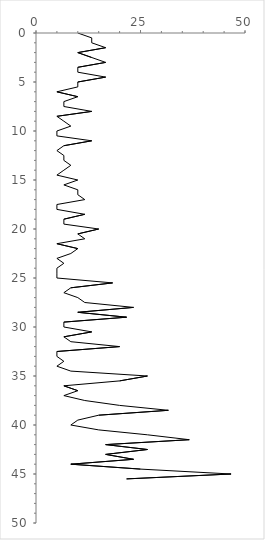
| Category | Series 0 |
|---|---|
| 10.000000000000002 | 0 |
| 13.333333333333334 | 0.5 |
| 13.333333333333334 | 1 |
| 16.666666666666664 | 1.5 |
| 10.000000000000002 | 2 |
| 13.333333333333334 | 2.5 |
| 16.666666666666664 | 3 |
| 10.000000000000002 | 3.5 |
| 10.000000000000002 | 4 |
| 16.666666666666664 | 4.5 |
| 10.000000000000002 | 5 |
| 10.0 | 5.5 |
| 5.000000000000001 | 6 |
| 10.0 | 6.5 |
| 6.666666666666667 | 7 |
| 6.666666666666667 | 7.5 |
| 13.333333333333334 | 8 |
| 5.000000000000001 | 8.5 |
| 6.666666666666667 | 9 |
| 8.333333333333332 | 9.5 |
| 5.000000000000001 | 10 |
| 5.000000000000001 | 10.5 |
| 13.333333333333334 | 11 |
| 6.666666666666667 | 11.5 |
| 5.000000000000001 | 12 |
| 6.666666666666667 | 12.5 |
| 6.666666666666667 | 13 |
| 8.333333333333332 | 13.5 |
| 6.666666666666667 | 14 |
| 5.000000000000001 | 14.5 |
| 10.0 | 15 |
| 6.666666666666667 | 15.5 |
| 10.0 | 16 |
| 10.0 | 16.5 |
| 11.666666666666668 | 17 |
| 5.000000000000001 | 17.5 |
| 5.000000000000001 | 18 |
| 11.666666666666668 | 18.5 |
| 6.666666666666667 | 19 |
| 6.666666666666667 | 19.5 |
| 15.0 | 20 |
| 10.000000000000002 | 20.5 |
| 11.666666666666668 | 21 |
| 5.000000000000001 | 21.5 |
| 10.0 | 22 |
| 8.333333333333332 | 22.5 |
| 5.000000000000001 | 23 |
| 6.666666666666667 | 23.5 |
| 5.000000000000001 | 24 |
| 5.000000000000001 | 24.5 |
| 5.000000000000001 | 25 |
| 18.333333333333336 | 25.5 |
| 8.333333333333332 | 26 |
| 6.666666666666667 | 26.5 |
| 10.000000000000002 | 27 |
| 11.666666666666668 | 27.5 |
| 23.333333333333332 | 28 |
| 10.000000000000002 | 28.5 |
| 21.666666666666668 | 29 |
| 6.666666666666667 | 29.5 |
| 6.666666666666667 | 30 |
| 13.333333333333334 | 30.5 |
| 6.666666666666667 | 31 |
| 8.333333333333332 | 31.5 |
| 20.0 | 32 |
| 5.000000000000001 | 32.5 |
| 5.000000000000001 | 33 |
| 6.666666666666667 | 33.5 |
| 5.000000000000001 | 34 |
| 8.333333333333332 | 34.5 |
| 26.666666666666668 | 35 |
| 20.000000000000004 | 35.5 |
| 6.666666666666667 | 36 |
| 10.0 | 36.5 |
| 6.666666666666667 | 37 |
| 11.666666666666666 | 37.5 |
| 20.000000000000004 | 38 |
| 31.66666666666667 | 38.5 |
| 15.0 | 39 |
| 10.000000000000002 | 39.5 |
| 8.333333333333332 | 40 |
| 15.0 | 40.5 |
| 26.666666666666668 | 41 |
| 36.66666666666667 | 41.5 |
| 16.666666666666664 | 42 |
| 26.666666666666668 | 42.5 |
| 16.666666666666664 | 43 |
| 23.333333333333332 | 43.5 |
| 8.333333333333332 | 44 |
| 25.0 | 44.5 |
| 46.666666666666664 | 45 |
| 21.666666666666668 | 45.5 |